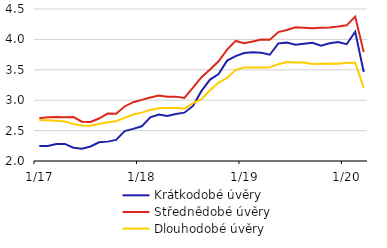
| Category | Krátkodobé úvěry | Střednědobé úvěry | Dlouhodobé úvěry |
|---|---|---|---|
|  1/17 | 2.247 | 2.702 | 2.673 |
| 2 | 2.246 | 2.718 | 2.67 |
| 3 | 2.278 | 2.724 | 2.662 |
| 4 | 2.281 | 2.719 | 2.649 |
| 5 | 2.218 | 2.722 | 2.608 |
| 6 | 2.203 | 2.646 | 2.586 |
| 7 | 2.238 | 2.641 | 2.579 |
| 8 | 2.307 | 2.699 | 2.61 |
| 9 | 2.319 | 2.781 | 2.637 |
| 10 | 2.347 | 2.778 | 2.653 |
| 11 | 2.493 | 2.897 | 2.708 |
| 12 | 2.529 | 2.967 | 2.764 |
|  1/18 | 2.57 | 3.006 | 2.796 |
| 2 | 2.72 | 3.044 | 2.838 |
| 3 | 2.765 | 3.078 | 2.866 |
| 4 | 2.739 | 3.057 | 2.871 |
| 5 | 2.773 | 3.059 | 2.877 |
| 6 | 2.795 | 3.036 | 2.859 |
| 7 | 2.906 | 3.206 | 2.952 |
| 8 | 3.153 | 3.379 | 3.018 |
| 9 | 3.34 | 3.504 | 3.165 |
| 10 | 3.429 | 3.639 | 3.29 |
| 11 | 3.651 | 3.832 | 3.366 |
| 12 | 3.724 | 3.975 | 3.498 |
|  1/19 | 3.775 | 3.936 | 3.539 |
| 2 | 3.788 | 3.965 | 3.537 |
| 3 | 3.78 | 3.997 | 3.539 |
| 4 | 3.748 | 3.996 | 3.541 |
| 5 | 3.935 | 4.121 | 3.592 |
| 6 | 3.947 | 4.153 | 3.628 |
| 7 | 3.912 | 4.201 | 3.62 |
| 8 | 3.929 | 4.192 | 3.621 |
| 9 | 3.943 | 4.183 | 3.595 |
| 10 | 3.898 | 4.191 | 3.6 |
| 11 | 3.937 | 4.198 | 3.602 |
| 12 | 3.955 | 4.212 | 3.598 |
|  1/20 | 3.921 | 4.231 | 3.616 |
| 2 | 4.127 | 4.375 | 3.616 |
| 3 | 3.464 | 3.791 | 3.208 |